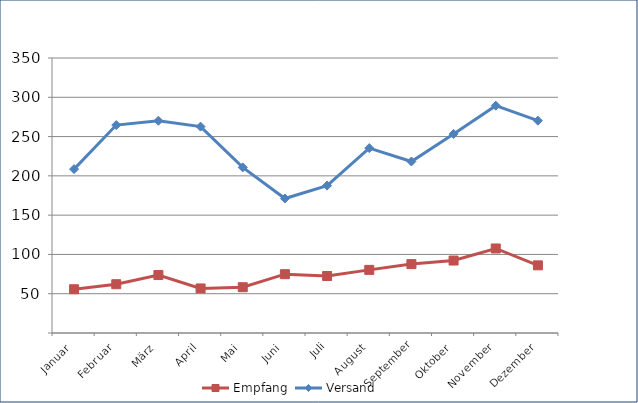
| Category | Empfang | Versand |
|---|---|---|
| Januar | 55.687 | 208.604 |
| Februar | 62.095 | 264.642 |
| März | 73.773 | 270.124 |
| April | 56.711 | 262.668 |
| Mai | 58.26 | 210.77 |
| Juni | 74.862 | 171.182 |
| Juli | 72.541 | 187.647 |
| August | 80.337 | 235.346 |
| September | 87.676 | 218.291 |
| Oktober | 92.229 | 253.355 |
| November | 107.573 | 289.299 |
| Dezember | 86.106 | 270.237 |